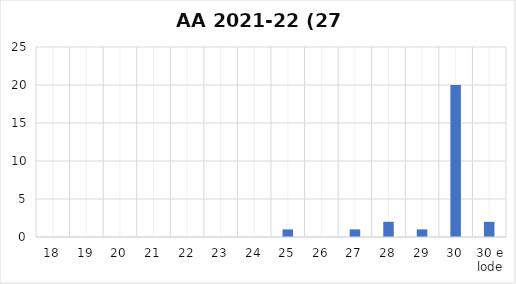
| Category | Series 0 |
|---|---|
| 18 | 0 |
| 19 | 0 |
| 20 | 0 |
| 21 | 0 |
| 22 | 0 |
| 23 | 0 |
| 24 | 0 |
| 25 | 1 |
| 26 | 0 |
| 27 | 1 |
| 28 | 2 |
| 29 | 1 |
| 30 | 20 |
| 30 e lode | 2 |